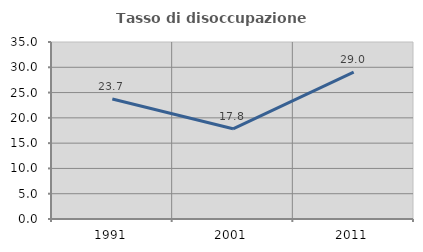
| Category | Tasso di disoccupazione giovanile  |
|---|---|
| 1991.0 | 23.736 |
| 2001.0 | 17.832 |
| 2011.0 | 29.041 |